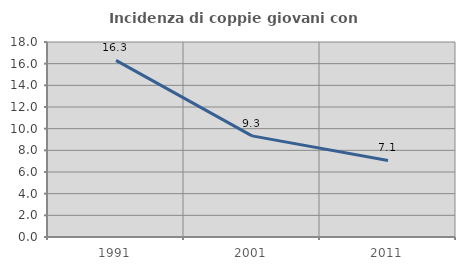
| Category | Incidenza di coppie giovani con figli |
|---|---|
| 1991.0 | 16.299 |
| 2001.0 | 9.334 |
| 2011.0 | 7.068 |